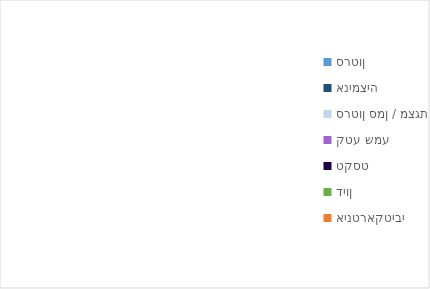
| Category | Series 0 |
|---|---|
| סרטון | 0 |
| אנימציה | 0 |
| סרטון סמן / מצגת | 0 |
| קטע שמע | 0 |
| טקסט | 0 |
| דיון | 0 |
| אינטראקטיבי | 0 |